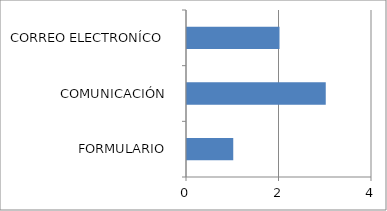
| Category | Series 0 |
|---|---|
| FORMULARIO  | 1 |
| COMUNICACIÓN  | 3 |
| CORREO ELECTRONÍCO  | 2 |